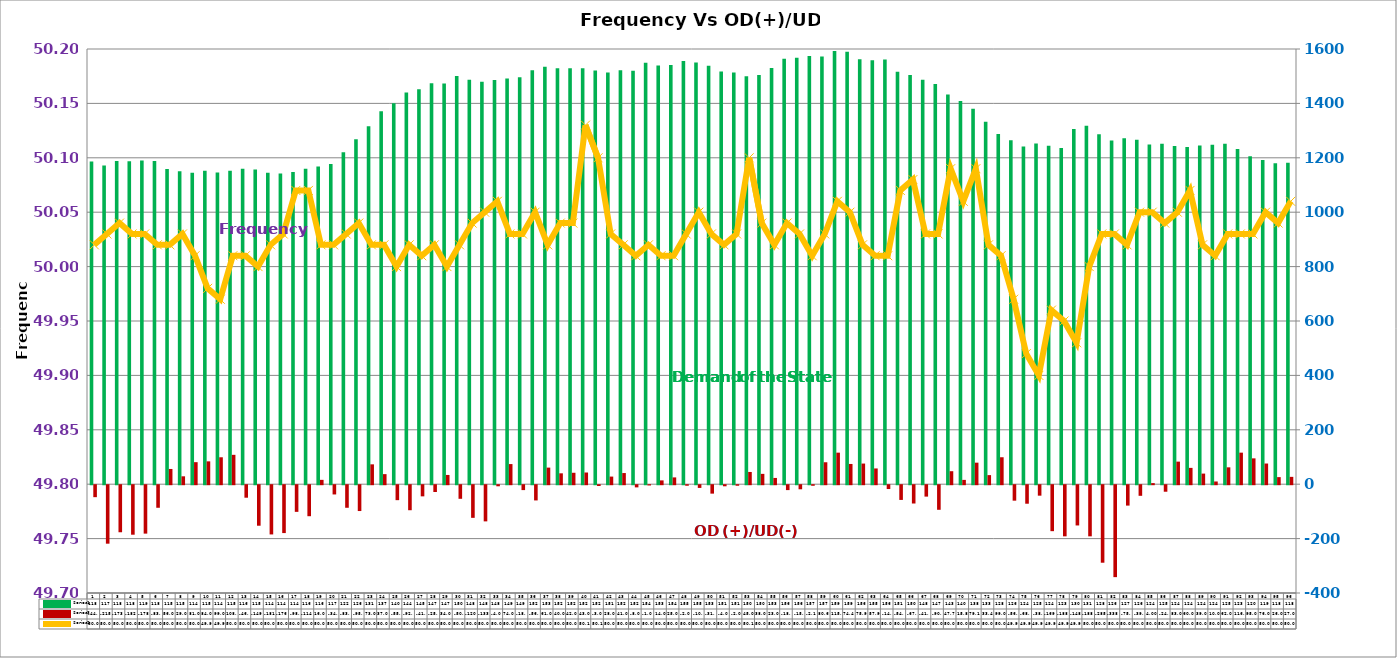
| Category | Series 2 | Series 4 |
|---|---|---|
| 0 | 1186 | -44 |
| 1 | 1172 | -215 |
| 2 | 1188 | -173 |
| 3 | 1187 | -182 |
| 4 | 1190 | -178 |
| 5 | 1188 | -83 |
| 6 | 1159 | 56 |
| 7 | 1151 | 29 |
| 8 | 1145 | 81 |
| 9 | 1152 | 84 |
| 10 | 1146 | 99 |
| 11 | 1152 | 108 |
| 12 | 1160 | -46 |
| 13 | 1157 | -149 |
| 14 | 1145 | -181 |
| 15 | 1142 | -176 |
| 16 | 1148 | -98 |
| 17 | 1160 | -114 |
| 18 | 1168 | 16 |
| 19 | 1177 | -34 |
| 20 | 1220 | -83 |
| 21 | 1268 | -95 |
| 22 | 1316 | 73 |
| 23 | 1371 | 37 |
| 24 | 1401 | -55 |
| 25 | 1440 | -92 |
| 26 | 1452 | -41 |
| 27 | 1474 | -25 |
| 28 | 1473 | 34 |
| 29 | 1501 | -50 |
| 30 | 1487 | -120 |
| 31 | 1480 | -133 |
| 32 | 1486 | -4 |
| 33 | 1492 | 74 |
| 34 | 1496 | -18 |
| 35 | 1522 | -56 |
| 36 | 1535 | 61 |
| 37 | 1529 | 40 |
| 38 | 1529 | 42 |
| 39 | 1529 | 43 |
| 40 | 1521 | -3 |
| 41 | 1514 | 28 |
| 42 | 1522 | 41 |
| 43 | 1520 | -8 |
| 44 | 1549 | -1 |
| 45 | 1539 | 14 |
| 46 | 1541 | 25 |
| 47 | 1556 | -2 |
| 48 | 1550 | -10 |
| 49 | 1538 | -31 |
| 50 | 1517 | -4 |
| 51 | 1514 | -2 |
| 52 | 1500 | 45 |
| 53 | 1504 | 38 |
| 54 | 1530 | 23 |
| 55 | 1564 | -18 |
| 56 | 1567.4 | -15.045 |
| 57 | 1573.88 | -2.125 |
| 58 | 1572.65 | 80.685 |
| 59 | 1592.25 | 115.965 |
| 60 | 1590.26 | 74.417 |
| 61 | 1562.02 | 75.903 |
| 62 | 1558.36 | 57.899 |
| 63 | 1561.42 | -14.092 |
| 64 | 1516.12 | -54.132 |
| 65 | 1504.69 | -67.314 |
| 66 | 1486.84 | -41.954 |
| 67 | 1471.38 | -90.43 |
| 68 | 1432.32 | 47.773 |
| 69 | 1408.49 | 15.857 |
| 70 | 1380.18 | 79.153 |
| 71 | 1332.98 | 33.413 |
| 72 | 1287.7 | 99.087 |
| 73 | 1264.74 | -56.861 |
| 74 | 1241.26 | -68.08 |
| 75 | 1253.03 | -38.501 |
| 76 | 1244 | -169 |
| 77 | 1236 | -188 |
| 78 | 1306 | -148 |
| 79 | 1318 | -188 |
| 80 | 1287 | -285 |
| 81 | 1264 | -338 |
| 82 | 1272 | -75 |
| 83 | 1266 | -39 |
| 84 | 1249 | 4 |
| 85 | 1252 | -24 |
| 86 | 1243 | 83 |
| 87 | 1240 | 60 |
| 88 | 1245 | 39 |
| 89 | 1248 | 10 |
| 90 | 1252 | 62 |
| 91 | 1232 | 116 |
| 92 | 1206 | 95 |
| 93 | 1192 | 76 |
| 94 | 1180 | 26 |
| 95 | 1182 | 27 |